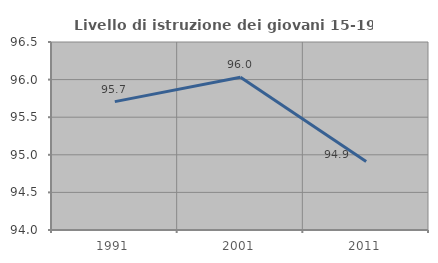
| Category | Livello di istruzione dei giovani 15-19 anni |
|---|---|
| 1991.0 | 95.707 |
| 2001.0 | 96.032 |
| 2011.0 | 94.91 |